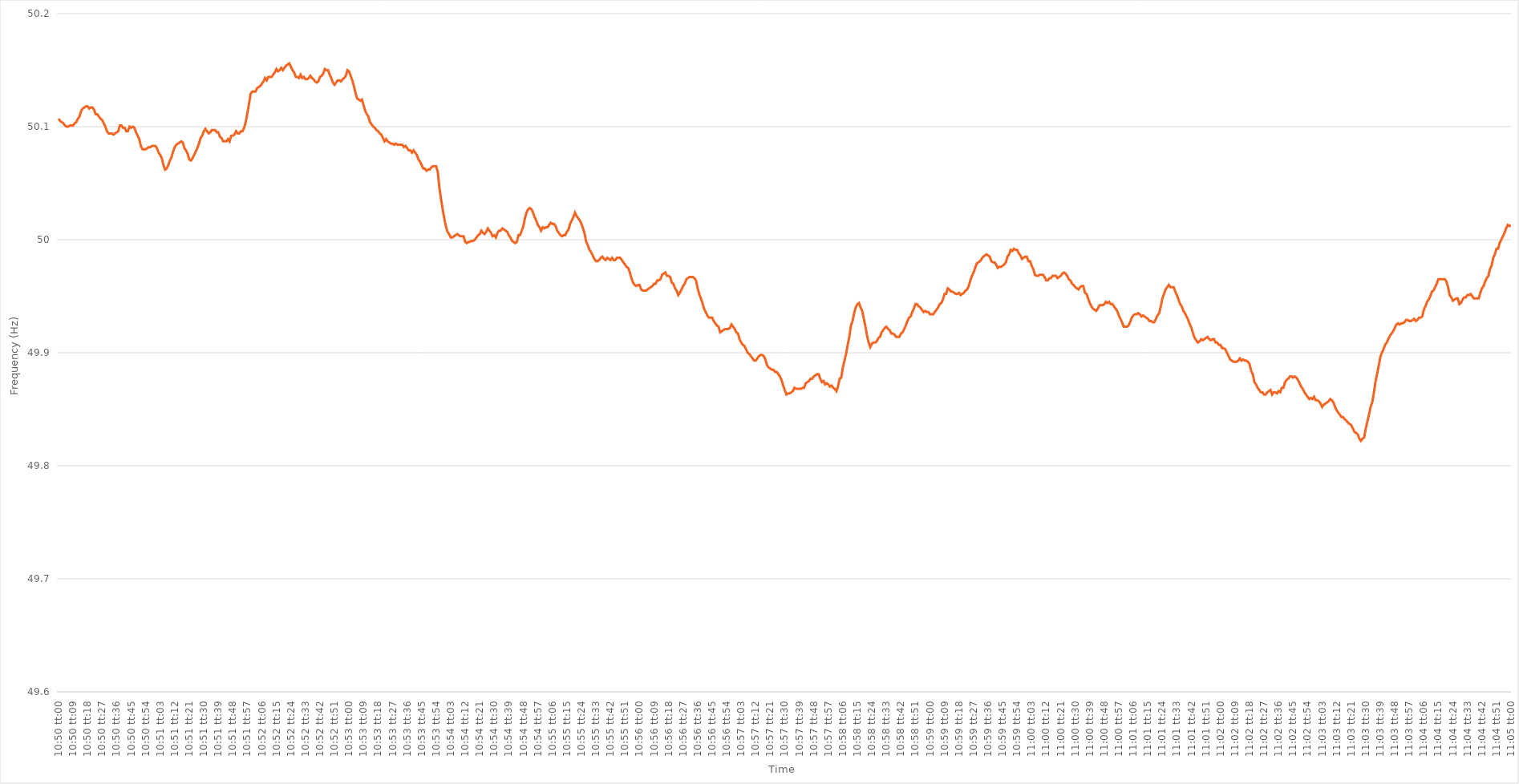
| Category | Series 0 |
|---|---|
| 0.4513888888888889 | 50.107 |
| 0.45140046296296293 | 50.105 |
| 0.4514120370370371 | 50.104 |
| 0.4514236111111111 | 50.103 |
| 0.4514351851851852 | 50.101 |
| 0.45144675925925926 | 50.1 |
| 0.45145833333333335 | 50.1 |
| 0.4514699074074074 | 50.101 |
| 0.45148148148148143 | 50.101 |
| 0.4514930555555556 | 50.101 |
| 0.4515046296296296 | 50.103 |
| 0.4515162037037037 | 50.104 |
| 0.45152777777777775 | 50.107 |
| 0.45153935185185184 | 50.109 |
| 0.4515509259259259 | 50.114 |
| 0.45156250000000003 | 50.116 |
| 0.45157407407407407 | 50.117 |
| 0.45158564814814817 | 50.118 |
| 0.4515972222222222 | 50.118 |
| 0.4516087962962963 | 50.116 |
| 0.45162037037037034 | 50.117 |
| 0.4516319444444445 | 50.117 |
| 0.4516435185185185 | 50.115 |
| 0.4516550925925926 | 50.111 |
| 0.45166666666666666 | 50.111 |
| 0.45167824074074076 | 50.109 |
| 0.4516898148148148 | 50.107 |
| 0.45170138888888894 | 50.106 |
| 0.451712962962963 | 50.103 |
| 0.451724537037037 | 50.1 |
| 0.4517361111111111 | 50.096 |
| 0.45174768518518515 | 50.094 |
| 0.45175925925925925 | 50.094 |
| 0.4517708333333333 | 50.094 |
| 0.45178240740740744 | 50.093 |
| 0.4517939814814815 | 50.094 |
| 0.45180555555555557 | 50.095 |
| 0.4518171296296296 | 50.096 |
| 0.4518287037037037 | 50.101 |
| 0.45184027777777774 | 50.101 |
| 0.4518518518518519 | 50.099 |
| 0.45186342592592593 | 50.099 |
| 0.451875 | 50.096 |
| 0.45188657407407407 | 50.096 |
| 0.45189814814814816 | 50.1 |
| 0.4519097222222222 | 50.099 |
| 0.45192129629629635 | 50.1 |
| 0.4519328703703704 | 50.099 |
| 0.4519444444444444 | 50.095 |
| 0.4519560185185185 | 50.092 |
| 0.45196759259259256 | 50.089 |
| 0.45197916666666665 | 50.083 |
| 0.4519907407407407 | 50.08 |
| 0.45200231481481484 | 50.08 |
| 0.4520138888888889 | 50.08 |
| 0.452025462962963 | 50.081 |
| 0.452037037037037 | 50.082 |
| 0.4520486111111111 | 50.082 |
| 0.45206018518518515 | 50.083 |
| 0.4520717592592593 | 50.083 |
| 0.45208333333333334 | 50.083 |
| 0.45209490740740743 | 50.081 |
| 0.45210648148148147 | 50.077 |
| 0.45211805555555556 | 50.075 |
| 0.4521296296296296 | 50.072 |
| 0.45214120370370375 | 50.066 |
| 0.4521527777777778 | 50.062 |
| 0.4521643518518519 | 50.063 |
| 0.4521759259259259 | 50.066 |
| 0.45218749999999996 | 50.07 |
| 0.45219907407407406 | 50.073 |
| 0.4522106481481481 | 50.078 |
| 0.45222222222222225 | 50.082 |
| 0.4522337962962963 | 50.084 |
| 0.4522453703703704 | 50.085 |
| 0.4522569444444444 | 50.086 |
| 0.4522685185185185 | 50.087 |
| 0.45228009259259255 | 50.086 |
| 0.4522916666666667 | 50.081 |
| 0.45230324074074074 | 50.079 |
| 0.45231481481481484 | 50.076 |
| 0.4523263888888889 | 50.071 |
| 0.45233796296296297 | 50.07 |
| 0.452349537037037 | 50.072 |
| 0.45236111111111116 | 50.075 |
| 0.4523726851851852 | 50.078 |
| 0.4523842592592593 | 50.081 |
| 0.45239583333333333 | 50.085 |
| 0.4524074074074074 | 50.09 |
| 0.45241898148148146 | 50.092 |
| 0.4524305555555555 | 50.096 |
| 0.45244212962962965 | 50.098 |
| 0.4524537037037037 | 50.096 |
| 0.4524652777777778 | 50.094 |
| 0.4524768518518518 | 50.095 |
| 0.4524884259259259 | 50.097 |
| 0.45249999999999996 | 50.097 |
| 0.4525115740740741 | 50.097 |
| 0.45252314814814815 | 50.095 |
| 0.45253472222222224 | 50.095 |
| 0.4525462962962963 | 50.091 |
| 0.4525578703703704 | 50.09 |
| 0.4525694444444444 | 50.087 |
| 0.45258101851851856 | 50.087 |
| 0.4525925925925926 | 50.087 |
| 0.4526041666666667 | 50.089 |
| 0.45261574074074074 | 50.087 |
| 0.45262731481481483 | 50.092 |
| 0.45263888888888887 | 50.092 |
| 0.452650462962963 | 50.093 |
| 0.45266203703703706 | 50.096 |
| 0.4526736111111111 | 50.094 |
| 0.4526851851851852 | 50.094 |
| 0.45269675925925923 | 50.096 |
| 0.4527083333333333 | 50.096 |
| 0.45271990740740736 | 50.099 |
| 0.4527314814814815 | 50.104 |
| 0.45274305555555555 | 50.112 |
| 0.45275462962962965 | 50.12 |
| 0.4527662037037037 | 50.129 |
| 0.4527777777777778 | 50.131 |
| 0.4527893518518518 | 50.131 |
| 0.45280092592592597 | 50.131 |
| 0.4528125 | 50.134 |
| 0.4528240740740741 | 50.135 |
| 0.45283564814814814 | 50.136 |
| 0.45284722222222223 | 50.138 |
| 0.4528587962962963 | 50.14 |
| 0.4528703703703704 | 50.143 |
| 0.45288194444444446 | 50.141 |
| 0.4528935185185185 | 50.144 |
| 0.4529050925925926 | 50.144 |
| 0.45291666666666663 | 50.144 |
| 0.45292824074074073 | 50.146 |
| 0.45293981481481477 | 50.148 |
| 0.4529513888888889 | 50.151 |
| 0.45296296296296296 | 50.149 |
| 0.45297453703703705 | 50.15 |
| 0.4529861111111111 | 50.152 |
| 0.4529976851851852 | 50.15 |
| 0.4530092592592592 | 50.152 |
| 0.4530208333333334 | 50.154 |
| 0.4530324074074074 | 50.155 |
| 0.4530439814814815 | 50.156 |
| 0.45305555555555554 | 50.153 |
| 0.45306712962962964 | 50.15 |
| 0.4530787037037037 | 50.148 |
| 0.45309027777777783 | 50.144 |
| 0.45310185185185187 | 50.144 |
| 0.45311342592592596 | 50.143 |
| 0.453125 | 50.146 |
| 0.45313657407407404 | 50.143 |
| 0.45314814814814813 | 50.144 |
| 0.45315972222222217 | 50.142 |
| 0.4531712962962963 | 50.142 |
| 0.45318287037037036 | 50.143 |
| 0.45319444444444446 | 50.145 |
| 0.4532060185185185 | 50.143 |
| 0.4532175925925926 | 50.142 |
| 0.4532291666666666 | 50.14 |
| 0.4532407407407408 | 50.139 |
| 0.4532523148148148 | 50.14 |
| 0.4532638888888889 | 50.144 |
| 0.45327546296296295 | 50.145 |
| 0.45328703703703704 | 50.147 |
| 0.4532986111111111 | 50.151 |
| 0.45331018518518523 | 50.15 |
| 0.45332175925925927 | 50.15 |
| 0.45333333333333337 | 50.146 |
| 0.4533449074074074 | 50.143 |
| 0.4533564814814815 | 50.139 |
| 0.45336805555555554 | 50.137 |
| 0.4533796296296296 | 50.139 |
| 0.4533912037037037 | 50.141 |
| 0.45340277777777777 | 50.141 |
| 0.45341435185185186 | 50.14 |
| 0.4534259259259259 | 50.142 |
| 0.4534375 | 50.143 |
| 0.45344907407407403 | 50.145 |
| 0.4534606481481482 | 50.15 |
| 0.4534722222222222 | 50.149 |
| 0.4534837962962963 | 50.145 |
| 0.45349537037037035 | 50.141 |
| 0.45350694444444445 | 50.136 |
| 0.4535185185185185 | 50.13 |
| 0.45353009259259264 | 50.125 |
| 0.4535416666666667 | 50.124 |
| 0.45355324074074077 | 50.123 |
| 0.4535648148148148 | 50.124 |
| 0.4535763888888889 | 50.119 |
| 0.45358796296296294 | 50.114 |
| 0.453599537037037 | 50.111 |
| 0.45361111111111113 | 50.109 |
| 0.45362268518518517 | 50.104 |
| 0.45363425925925926 | 50.102 |
| 0.4536458333333333 | 50.1 |
| 0.4536574074074074 | 50.099 |
| 0.45366898148148144 | 50.097 |
| 0.4536805555555556 | 50.096 |
| 0.4536921296296296 | 50.094 |
| 0.4537037037037037 | 50.093 |
| 0.45371527777777776 | 50.09 |
| 0.45372685185185185 | 50.087 |
| 0.4537384259259259 | 50.089 |
| 0.45375000000000004 | 50.087 |
| 0.4537615740740741 | 50.086 |
| 0.4537731481481482 | 50.085 |
| 0.4537847222222222 | 50.085 |
| 0.4537962962962963 | 50.084 |
| 0.45380787037037035 | 50.085 |
| 0.4538194444444445 | 50.084 |
| 0.45383101851851854 | 50.084 |
| 0.4538425925925926 | 50.084 |
| 0.45385416666666667 | 50.084 |
| 0.4538657407407407 | 50.082 |
| 0.4538773148148148 | 50.083 |
| 0.45388888888888884 | 50.081 |
| 0.453900462962963 | 50.079 |
| 0.45391203703703703 | 50.079 |
| 0.4539236111111111 | 50.077 |
| 0.45393518518518516 | 50.079 |
| 0.45394675925925926 | 50.077 |
| 0.4539583333333333 | 50.075 |
| 0.45396990740740745 | 50.071 |
| 0.4539814814814815 | 50.069 |
| 0.4539930555555556 | 50.066 |
| 0.4540046296296296 | 50.063 |
| 0.4540162037037037 | 50.063 |
| 0.45402777777777775 | 50.061 |
| 0.4540393518518519 | 50.062 |
| 0.45405092592592594 | 50.062 |
| 0.45406250000000004 | 50.064 |
| 0.4540740740740741 | 50.065 |
| 0.4540856481481481 | 50.065 |
| 0.4540972222222222 | 50.065 |
| 0.45410879629629625 | 50.06 |
| 0.4541203703703704 | 50.046 |
| 0.45413194444444444 | 50.036 |
| 0.45414351851851853 | 50.027 |
| 0.45415509259259257 | 50.019 |
| 0.45416666666666666 | 50.012 |
| 0.4541782407407407 | 50.007 |
| 0.45418981481481485 | 50.005 |
| 0.4542013888888889 | 50.002 |
| 0.454212962962963 | 50.002 |
| 0.454224537037037 | 50.003 |
| 0.4542361111111111 | 50.004 |
| 0.45424768518518516 | 50.005 |
| 0.4542592592592593 | 50.004 |
| 0.45427083333333335 | 50.003 |
| 0.45428240740740744 | 50.003 |
| 0.4542939814814815 | 50.003 |
| 0.4543055555555556 | 49.998 |
| 0.4543171296296296 | 49.997 |
| 0.45432870370370365 | 49.998 |
| 0.4543402777777778 | 49.998 |
| 0.45435185185185184 | 49.999 |
| 0.45436342592592593 | 49.999 |
| 0.454375 | 50 |
| 0.45438657407407407 | 50.002 |
| 0.4543981481481481 | 50.004 |
| 0.45440972222222226 | 50.005 |
| 0.4544212962962963 | 50.008 |
| 0.4544328703703704 | 50.006 |
| 0.45444444444444443 | 50.005 |
| 0.4544560185185185 | 50.007 |
| 0.45446759259259256 | 50.01 |
| 0.4544791666666667 | 50.008 |
| 0.45449074074074075 | 50.006 |
| 0.45450231481481485 | 50.003 |
| 0.4545138888888889 | 50.004 |
| 0.454525462962963 | 50.002 |
| 0.454537037037037 | 50.006 |
| 0.45454861111111106 | 50.008 |
| 0.4545601851851852 | 50.008 |
| 0.45457175925925924 | 50.01 |
| 0.45458333333333334 | 50.009 |
| 0.4545949074074074 | 50.008 |
| 0.4546064814814815 | 50.007 |
| 0.4546180555555555 | 50.004 |
| 0.45462962962962966 | 50.002 |
| 0.4546412037037037 | 49.999 |
| 0.4546527777777778 | 49.998 |
| 0.45466435185185183 | 49.997 |
| 0.45467592592592593 | 49.998 |
| 0.45468749999999997 | 50.004 |
| 0.4546990740740741 | 50.004 |
| 0.45471064814814816 | 50.008 |
| 0.45472222222222225 | 50.012 |
| 0.4547337962962963 | 50.019 |
| 0.4547453703703704 | 50.024 |
| 0.4547569444444444 | 50.027 |
| 0.45476851851851857 | 50.028 |
| 0.4547800925925926 | 50.027 |
| 0.45479166666666665 | 50.024 |
| 0.45480324074074074 | 50.02 |
| 0.4548148148148148 | 50.017 |
| 0.4548263888888889 | 50.013 |
| 0.4548379629629629 | 50.011 |
| 0.45484953703703707 | 50.008 |
| 0.4548611111111111 | 50.011 |
| 0.4548726851851852 | 50.01 |
| 0.45488425925925924 | 50.011 |
| 0.45489583333333333 | 50.011 |
| 0.45490740740740737 | 50.013 |
| 0.4549189814814815 | 50.015 |
| 0.45493055555555556 | 50.014 |
| 0.45494212962962965 | 50.014 |
| 0.4549537037037037 | 50.012 |
| 0.4549652777777778 | 50.008 |
| 0.4549768518518518 | 50.006 |
| 0.454988425925926 | 50.004 |
| 0.455 | 50.003 |
| 0.4550115740740741 | 50.004 |
| 0.45502314814814815 | 50.004 |
| 0.4550347222222222 | 50.007 |
| 0.4550462962962963 | 50.009 |
| 0.4550578703703703 | 50.014 |
| 0.45506944444444447 | 50.017 |
| 0.4550810185185185 | 50.02 |
| 0.4550925925925926 | 50.024 |
| 0.45510416666666664 | 50.021 |
| 0.45511574074074074 | 50.019 |
| 0.4551273148148148 | 50.017 |
| 0.4551388888888889 | 50.014 |
| 0.45515046296296297 | 50.01 |
| 0.45516203703703706 | 50.005 |
| 0.4551736111111111 | 49.998 |
| 0.4551851851851852 | 49.995 |
| 0.45519675925925923 | 49.991 |
| 0.4552083333333334 | 49.989 |
| 0.4552199074074074 | 49.986 |
| 0.4552314814814815 | 49.983 |
| 0.45524305555555555 | 49.981 |
| 0.45525462962962965 | 49.981 |
| 0.4552662037037037 | 49.982 |
| 0.4552777777777777 | 49.984 |
| 0.4552893518518519 | 49.985 |
| 0.4553009259259259 | 49.983 |
| 0.4553125 | 49.982 |
| 0.45532407407407405 | 49.984 |
| 0.45533564814814814 | 49.983 |
| 0.4553472222222222 | 49.982 |
| 0.45535879629629633 | 49.984 |
| 0.45537037037037037 | 49.982 |
| 0.45538194444444446 | 49.982 |
| 0.4553935185185185 | 49.984 |
| 0.4554050925925926 | 49.984 |
| 0.45541666666666664 | 49.984 |
| 0.4554282407407408 | 49.982 |
| 0.4554398148148148 | 49.98 |
| 0.4554513888888889 | 49.978 |
| 0.45546296296296296 | 49.976 |
| 0.45547453703703705 | 49.975 |
| 0.4554861111111111 | 49.971 |
| 0.45549768518518513 | 49.966 |
| 0.4555092592592593 | 49.962 |
| 0.4555208333333333 | 49.96 |
| 0.4555324074074074 | 49.959 |
| 0.45554398148148145 | 49.96 |
| 0.45555555555555555 | 49.96 |
| 0.4555671296296296 | 49.956 |
| 0.45557870370370374 | 49.955 |
| 0.4555902777777778 | 49.955 |
| 0.45560185185185187 | 49.955 |
| 0.4556134259259259 | 49.956 |
| 0.455625 | 49.957 |
| 0.45563657407407404 | 49.958 |
| 0.4556481481481482 | 49.959 |
| 0.45565972222222223 | 49.961 |
| 0.4556712962962963 | 49.961 |
| 0.45568287037037036 | 49.964 |
| 0.45569444444444446 | 49.964 |
| 0.4557060185185185 | 49.965 |
| 0.45571759259259265 | 49.969 |
| 0.4557291666666667 | 49.97 |
| 0.4557407407407407 | 49.971 |
| 0.4557523148148148 | 49.968 |
| 0.45576388888888886 | 49.968 |
| 0.45577546296296295 | 49.967 |
| 0.455787037037037 | 49.962 |
| 0.45579861111111114 | 49.961 |
| 0.4558101851851852 | 49.957 |
| 0.4558217592592593 | 49.955 |
| 0.4558333333333333 | 49.951 |
| 0.4558449074074074 | 49.953 |
| 0.45585648148148145 | 49.956 |
| 0.4558680555555556 | 49.959 |
| 0.45587962962962963 | 49.961 |
| 0.45589120370370373 | 49.965 |
| 0.45590277777777777 | 49.966 |
| 0.45591435185185186 | 49.967 |
| 0.4559259259259259 | 49.967 |
| 0.45593750000000005 | 49.967 |
| 0.4559490740740741 | 49.966 |
| 0.4559606481481482 | 49.964 |
| 0.4559722222222222 | 49.957 |
| 0.45598379629629626 | 49.952 |
| 0.45599537037037036 | 49.948 |
| 0.4560069444444444 | 49.944 |
| 0.45601851851851855 | 49.939 |
| 0.4560300925925926 | 49.936 |
| 0.4560416666666667 | 49.933 |
| 0.4560532407407407 | 49.931 |
| 0.4560648148148148 | 49.931 |
| 0.45607638888888885 | 49.931 |
| 0.456087962962963 | 49.928 |
| 0.45609953703703704 | 49.926 |
| 0.45611111111111113 | 49.924 |
| 0.4561226851851852 | 49.923 |
| 0.45613425925925927 | 49.918 |
| 0.4561458333333333 | 49.919 |
| 0.45615740740740746 | 49.92 |
| 0.4561689814814815 | 49.921 |
| 0.4561805555555556 | 49.921 |
| 0.45619212962962963 | 49.921 |
| 0.45620370370370367 | 49.922 |
| 0.45621527777777776 | 49.925 |
| 0.4562268518518518 | 49.923 |
| 0.45623842592592595 | 49.921 |
| 0.45625 | 49.918 |
| 0.4562615740740741 | 49.917 |
| 0.4562731481481481 | 49.912 |
| 0.4562847222222222 | 49.909 |
| 0.45629629629629626 | 49.907 |
| 0.4563078703703704 | 49.906 |
| 0.45631944444444444 | 49.903 |
| 0.45633101851851854 | 49.9 |
| 0.4563425925925926 | 49.899 |
| 0.45635416666666667 | 49.897 |
| 0.4563657407407407 | 49.895 |
| 0.45637731481481486 | 49.893 |
| 0.4563888888888889 | 49.893 |
| 0.456400462962963 | 49.895 |
| 0.45641203703703703 | 49.897 |
| 0.4564236111111111 | 49.898 |
| 0.45643518518518517 | 49.898 |
| 0.4564467592592592 | 49.897 |
| 0.45645833333333335 | 49.894 |
| 0.4564699074074074 | 49.889 |
| 0.4564814814814815 | 49.887 |
| 0.4564930555555555 | 49.886 |
| 0.4565046296296296 | 49.885 |
| 0.45651620370370366 | 49.885 |
| 0.4565277777777778 | 49.883 |
| 0.45653935185185185 | 49.883 |
| 0.45655092592592594 | 49.881 |
| 0.4565625 | 49.879 |
| 0.4565740740740741 | 49.876 |
| 0.4565856481481481 | 49.871 |
| 0.45659722222222227 | 49.867 |
| 0.4566087962962963 | 49.863 |
| 0.4566203703703704 | 49.864 |
| 0.45663194444444444 | 49.864 |
| 0.45664351851851853 | 49.865 |
| 0.45665509259259257 | 49.866 |
| 0.4566666666666667 | 49.869 |
| 0.45667824074074076 | 49.868 |
| 0.4566898148148148 | 49.868 |
| 0.4567013888888889 | 49.868 |
| 0.45671296296296293 | 49.868 |
| 0.456724537037037 | 49.869 |
| 0.45673611111111106 | 49.869 |
| 0.4567476851851852 | 49.873 |
| 0.45675925925925925 | 49.874 |
| 0.45677083333333335 | 49.875 |
| 0.4567824074074074 | 49.877 |
| 0.4567939814814815 | 49.877 |
| 0.4568055555555555 | 49.879 |
| 0.45681712962962967 | 49.88 |
| 0.4568287037037037 | 49.881 |
| 0.4568402777777778 | 49.881 |
| 0.45685185185185184 | 49.877 |
| 0.45686342592592594 | 49.874 |
| 0.456875 | 49.875 |
| 0.4568865740740741 | 49.872 |
| 0.45689814814814816 | 49.873 |
| 0.45690972222222226 | 49.872 |
| 0.4569212962962963 | 49.87 |
| 0.45693287037037034 | 49.871 |
| 0.45694444444444443 | 49.869 |
| 0.45695601851851847 | 49.868 |
| 0.4569675925925926 | 49.866 |
| 0.45697916666666666 | 49.87 |
| 0.45699074074074075 | 49.877 |
| 0.4570023148148148 | 49.878 |
| 0.4570138888888889 | 49.887 |
| 0.4570254629629629 | 49.893 |
| 0.4570370370370371 | 49.899 |
| 0.4570486111111111 | 49.907 |
| 0.4570601851851852 | 49.914 |
| 0.45707175925925925 | 49.924 |
| 0.45708333333333334 | 49.928 |
| 0.4570949074074074 | 49.935 |
| 0.45710648148148153 | 49.94 |
| 0.45711805555555557 | 49.943 |
| 0.45712962962962966 | 49.944 |
| 0.4571412037037037 | 49.94 |
| 0.45715277777777774 | 49.937 |
| 0.45716435185185184 | 49.93 |
| 0.4571759259259259 | 49.923 |
| 0.4571875 | 49.915 |
| 0.45719907407407406 | 49.909 |
| 0.45721064814814816 | 49.905 |
| 0.4572222222222222 | 49.908 |
| 0.4572337962962963 | 49.909 |
| 0.45724537037037033 | 49.909 |
| 0.4572569444444445 | 49.91 |
| 0.4572685185185185 | 49.913 |
| 0.4572800925925926 | 49.914 |
| 0.45729166666666665 | 49.918 |
| 0.45730324074074075 | 49.92 |
| 0.4573148148148148 | 49.922 |
| 0.45732638888888894 | 49.923 |
| 0.457337962962963 | 49.921 |
| 0.45734953703703707 | 49.92 |
| 0.4573611111111111 | 49.917 |
| 0.4573726851851852 | 49.917 |
| 0.45738425925925924 | 49.916 |
| 0.4573958333333333 | 49.914 |
| 0.45740740740740743 | 49.914 |
| 0.45741898148148147 | 49.914 |
| 0.45743055555555556 | 49.917 |
| 0.4574421296296296 | 49.918 |
| 0.4574537037037037 | 49.921 |
| 0.45746527777777773 | 49.924 |
| 0.4574768518518519 | 49.928 |
| 0.4574884259259259 | 49.931 |
| 0.4575 | 49.932 |
| 0.45751157407407406 | 49.936 |
| 0.45752314814814815 | 49.939 |
| 0.4575347222222222 | 49.943 |
| 0.45754629629629634 | 49.943 |
| 0.4575578703703704 | 49.941 |
| 0.4575694444444445 | 49.94 |
| 0.4575810185185185 | 49.938 |
| 0.4575925925925926 | 49.936 |
| 0.45760416666666665 | 49.937 |
| 0.4576157407407408 | 49.936 |
| 0.45762731481481483 | 49.936 |
| 0.4576388888888889 | 49.934 |
| 0.45765046296296297 | 49.934 |
| 0.457662037037037 | 49.934 |
| 0.4576736111111111 | 49.936 |
| 0.45768518518518514 | 49.938 |
| 0.4576967592592593 | 49.94 |
| 0.45770833333333333 | 49.943 |
| 0.4577199074074074 | 49.944 |
| 0.45773148148148146 | 49.947 |
| 0.45774305555555556 | 49.952 |
| 0.4577546296296296 | 49.952 |
| 0.45776620370370374 | 49.957 |
| 0.4577777777777778 | 49.956 |
| 0.4577893518518519 | 49.954 |
| 0.4578009259259259 | 49.954 |
| 0.4578125 | 49.953 |
| 0.45782407407407405 | 49.952 |
| 0.4578356481481482 | 49.952 |
| 0.45784722222222224 | 49.953 |
| 0.45785879629629633 | 49.951 |
| 0.45787037037037037 | 49.952 |
| 0.4578819444444444 | 49.953 |
| 0.4578935185185185 | 49.955 |
| 0.45790509259259254 | 49.956 |
| 0.4579166666666667 | 49.959 |
| 0.45792824074074073 | 49.964 |
| 0.4579398148148148 | 49.968 |
| 0.45795138888888887 | 49.971 |
| 0.45796296296296296 | 49.975 |
| 0.457974537037037 | 49.979 |
| 0.45798611111111115 | 49.98 |
| 0.4579976851851852 | 49.981 |
| 0.4580092592592593 | 49.983 |
| 0.4580208333333333 | 49.985 |
| 0.4580324074074074 | 49.986 |
| 0.45804398148148145 | 49.987 |
| 0.4580555555555556 | 49.986 |
| 0.45806712962962964 | 49.985 |
| 0.45807870370370374 | 49.981 |
| 0.4580902777777778 | 49.98 |
| 0.4581018518518518 | 49.98 |
| 0.4581134259259259 | 49.978 |
| 0.45812499999999995 | 49.975 |
| 0.4581365740740741 | 49.976 |
| 0.45814814814814814 | 49.976 |
| 0.45815972222222223 | 49.977 |
| 0.45817129629629627 | 49.978 |
| 0.45818287037037037 | 49.98 |
| 0.4581944444444444 | 49.985 |
| 0.45820601851851855 | 49.987 |
| 0.4582175925925926 | 49.991 |
| 0.4582291666666667 | 49.99 |
| 0.4582407407407407 | 49.992 |
| 0.4582523148148148 | 49.991 |
| 0.45826388888888886 | 49.991 |
| 0.458275462962963 | 49.988 |
| 0.45828703703703705 | 49.986 |
| 0.45829861111111114 | 49.983 |
| 0.4583101851851852 | 49.984 |
| 0.4583217592592593 | 49.985 |
| 0.4583333333333333 | 49.985 |
| 0.45834490740740735 | 49.981 |
| 0.4583564814814815 | 49.981 |
| 0.45836805555555554 | 49.977 |
| 0.45837962962962964 | 49.974 |
| 0.4583912037037037 | 49.969 |
| 0.45840277777777777 | 49.968 |
| 0.4584143518518518 | 49.968 |
| 0.45842592592592596 | 49.969 |
| 0.4584375 | 49.969 |
| 0.4584490740740741 | 49.969 |
| 0.45846064814814813 | 49.967 |
| 0.4584722222222222 | 49.964 |
| 0.45848379629629626 | 49.964 |
| 0.4584953703703704 | 49.966 |
| 0.45850694444444445 | 49.966 |
| 0.45851851851851855 | 49.968 |
| 0.4585300925925926 | 49.968 |
| 0.4585416666666667 | 49.968 |
| 0.4585532407407407 | 49.966 |
| 0.45856481481481487 | 49.967 |
| 0.4585763888888889 | 49.968 |
| 0.45858796296296295 | 49.97 |
| 0.45859953703703704 | 49.971 |
| 0.4586111111111111 | 49.97 |
| 0.4586226851851852 | 49.968 |
| 0.4586342592592592 | 49.965 |
| 0.45864583333333336 | 49.964 |
| 0.4586574074074074 | 49.961 |
| 0.4586689814814815 | 49.96 |
| 0.45868055555555554 | 49.958 |
| 0.45869212962962963 | 49.957 |
| 0.45870370370370367 | 49.956 |
| 0.4587152777777778 | 49.958 |
| 0.45872685185185186 | 49.959 |
| 0.45873842592592595 | 49.959 |
| 0.45875 | 49.953 |
| 0.4587615740740741 | 49.952 |
| 0.4587731481481481 | 49.948 |
| 0.4587847222222223 | 49.944 |
| 0.4587962962962963 | 49.941 |
| 0.45880787037037035 | 49.939 |
| 0.45881944444444445 | 49.938 |
| 0.4588310185185185 | 49.937 |
| 0.4588425925925926 | 49.939 |
| 0.4588541666666666 | 49.942 |
| 0.45886574074074077 | 49.942 |
| 0.4588773148148148 | 49.942 |
| 0.4588888888888889 | 49.943 |
| 0.45890046296296294 | 49.945 |
| 0.45891203703703703 | 49.944 |
| 0.4589236111111111 | 49.945 |
| 0.4589351851851852 | 49.943 |
| 0.45894675925925926 | 49.943 |
| 0.45895833333333336 | 49.941 |
| 0.4589699074074074 | 49.939 |
| 0.4589814814814815 | 49.937 |
| 0.45899305555555553 | 49.933 |
| 0.4590046296296297 | 49.93 |
| 0.4590162037037037 | 49.927 |
| 0.4590277777777778 | 49.923 |
| 0.45903935185185185 | 49.923 |
| 0.4590509259259259 | 49.923 |
| 0.4590625 | 49.924 |
| 0.459074074074074 | 49.927 |
| 0.4590856481481482 | 49.931 |
| 0.4590972222222222 | 49.933 |
| 0.4591087962962963 | 49.934 |
| 0.45912037037037035 | 49.934 |
| 0.45913194444444444 | 49.935 |
| 0.4591435185185185 | 49.934 |
| 0.45915509259259263 | 49.932 |
| 0.45916666666666667 | 49.933 |
| 0.45917824074074076 | 49.932 |
| 0.4591898148148148 | 49.931 |
| 0.4592013888888889 | 49.93 |
| 0.45921296296296293 | 49.928 |
| 0.4592245370370371 | 49.928 |
| 0.4592361111111111 | 49.927 |
| 0.4592476851851852 | 49.927 |
| 0.45925925925925926 | 49.93 |
| 0.45927083333333335 | 49.933 |
| 0.4592824074074074 | 49.935 |
| 0.45929398148148143 | 49.941 |
| 0.4593055555555556 | 49.948 |
| 0.4593171296296296 | 49.952 |
| 0.4593287037037037 | 49.956 |
| 0.45934027777777775 | 49.958 |
| 0.45935185185185184 | 49.96 |
| 0.4593634259259259 | 49.958 |
| 0.45937500000000003 | 49.958 |
| 0.45938657407407407 | 49.958 |
| 0.45939814814814817 | 49.954 |
| 0.4594097222222222 | 49.951 |
| 0.4594212962962963 | 49.947 |
| 0.45943287037037034 | 49.943 |
| 0.4594444444444445 | 49.941 |
| 0.4594560185185185 | 49.937 |
| 0.4594675925925926 | 49.935 |
| 0.45947916666666666 | 49.932 |
| 0.45949074074074076 | 49.929 |
| 0.4595023148148148 | 49.925 |
| 0.45951388888888894 | 49.922 |
| 0.459525462962963 | 49.917 |
| 0.459537037037037 | 49.913 |
| 0.4595486111111111 | 49.911 |
| 0.45956018518518515 | 49.909 |
| 0.45957175925925925 | 49.91 |
| 0.4595833333333333 | 49.912 |
| 0.45959490740740744 | 49.911 |
| 0.4596064814814815 | 49.912 |
| 0.45961805555555557 | 49.913 |
| 0.4596296296296296 | 49.914 |
| 0.4596412037037037 | 49.912 |
| 0.45965277777777774 | 49.911 |
| 0.4596643518518519 | 49.912 |
| 0.45967592592592593 | 49.912 |
| 0.4596875 | 49.909 |
| 0.45969907407407407 | 49.909 |
| 0.45971064814814816 | 49.907 |
| 0.4597222222222222 | 49.907 |
| 0.45973379629629635 | 49.904 |
| 0.4597453703703704 | 49.904 |
| 0.4597569444444444 | 49.903 |
| 0.4597685185185185 | 49.9 |
| 0.45978009259259256 | 49.897 |
| 0.45979166666666665 | 49.894 |
| 0.4598032407407407 | 49.893 |
| 0.45981481481481484 | 49.892 |
| 0.4598263888888889 | 49.892 |
| 0.459837962962963 | 49.892 |
| 0.459849537037037 | 49.893 |
| 0.4598611111111111 | 49.895 |
| 0.45987268518518515 | 49.893 |
| 0.4598842592592593 | 49.894 |
| 0.45989583333333334 | 49.893 |
| 0.45990740740740743 | 49.893 |
| 0.45991898148148147 | 49.892 |
| 0.45993055555555556 | 49.89 |
| 0.4599421296296296 | 49.884 |
| 0.45995370370370375 | 49.881 |
| 0.4599652777777778 | 49.874 |
| 0.4599768518518519 | 49.872 |
| 0.4599884259259259 | 49.869 |
| 0.45999999999999996 | 49.867 |
| 0.46001157407407406 | 49.865 |
| 0.4600231481481481 | 49.865 |
| 0.46003472222222225 | 49.863 |
| 0.4600462962962963 | 49.863 |
| 0.4600578703703704 | 49.865 |
| 0.4600694444444444 | 49.866 |
| 0.4600810185185185 | 49.867 |
| 0.46009259259259255 | 49.863 |
| 0.4601041666666667 | 49.865 |
| 0.46011574074074074 | 49.865 |
| 0.46012731481481484 | 49.864 |
| 0.4601388888888889 | 49.866 |
| 0.46015046296296297 | 49.865 |
| 0.460162037037037 | 49.869 |
| 0.46017361111111116 | 49.869 |
| 0.4601851851851852 | 49.874 |
| 0.4601967592592593 | 49.876 |
| 0.46020833333333333 | 49.877 |
| 0.4602199074074074 | 49.879 |
| 0.46023148148148146 | 49.879 |
| 0.4602430555555555 | 49.878 |
| 0.46025462962962965 | 49.879 |
| 0.4602662037037037 | 49.878 |
| 0.4602777777777778 | 49.876 |
| 0.4602893518518518 | 49.873 |
| 0.4603009259259259 | 49.87 |
| 0.46031249999999996 | 49.868 |
| 0.4603240740740741 | 49.865 |
| 0.46033564814814815 | 49.863 |
| 0.46034722222222224 | 49.861 |
| 0.4603587962962963 | 49.859 |
| 0.4603703703703704 | 49.86 |
| 0.4603819444444444 | 49.859 |
| 0.46039351851851856 | 49.861 |
| 0.4604050925925926 | 49.858 |
| 0.4604166666666667 | 49.858 |
| 0.46042824074074074 | 49.857 |
| 0.46043981481481483 | 49.855 |
| 0.46045138888888887 | 49.852 |
| 0.460462962962963 | 49.854 |
| 0.46047453703703706 | 49.855 |
| 0.4604861111111111 | 49.856 |
| 0.4604976851851852 | 49.857 |
| 0.46050925925925923 | 49.859 |
| 0.4605208333333333 | 49.858 |
| 0.46053240740740736 | 49.856 |
| 0.4605439814814815 | 49.852 |
| 0.46055555555555555 | 49.849 |
| 0.46056712962962965 | 49.847 |
| 0.4605787037037037 | 49.845 |
| 0.4605902777777778 | 49.843 |
| 0.4606018518518518 | 49.843 |
| 0.46061342592592597 | 49.841 |
| 0.460625 | 49.84 |
| 0.4606365740740741 | 49.838 |
| 0.46064814814814814 | 49.837 |
| 0.46065972222222223 | 49.836 |
| 0.4606712962962963 | 49.833 |
| 0.4606828703703704 | 49.83 |
| 0.46069444444444446 | 49.829 |
| 0.4607060185185185 | 49.828 |
| 0.4607175925925926 | 49.824 |
| 0.46072916666666663 | 49.822 |
| 0.46074074074074073 | 49.824 |
| 0.46075231481481477 | 49.825 |
| 0.4607638888888889 | 49.833 |
| 0.46077546296296296 | 49.839 |
| 0.46078703703703705 | 49.845 |
| 0.4607986111111111 | 49.852 |
| 0.4608101851851852 | 49.856 |
| 0.4608217592592592 | 49.864 |
| 0.4608333333333334 | 49.874 |
| 0.4608449074074074 | 49.881 |
| 0.4608564814814815 | 49.888 |
| 0.46086805555555554 | 49.896 |
| 0.46087962962962964 | 49.9 |
| 0.4608912037037037 | 49.903 |
| 0.46090277777777783 | 49.907 |
| 0.46091435185185187 | 49.909 |
| 0.46092592592592596 | 49.912 |
| 0.4609375 | 49.915 |
| 0.46094907407407404 | 49.917 |
| 0.46096064814814813 | 49.919 |
| 0.46097222222222217 | 49.922 |
| 0.4609837962962963 | 49.925 |
| 0.46099537037037036 | 49.926 |
| 0.46100694444444446 | 49.925 |
| 0.4610185185185185 | 49.926 |
| 0.4610300925925926 | 49.926 |
| 0.4610416666666666 | 49.927 |
| 0.4610532407407408 | 49.929 |
| 0.4610648148148148 | 49.929 |
| 0.4610763888888889 | 49.928 |
| 0.46108796296296295 | 49.928 |
| 0.46109953703703704 | 49.929 |
| 0.4611111111111111 | 49.93 |
| 0.46112268518518523 | 49.928 |
| 0.46113425925925927 | 49.929 |
| 0.46114583333333337 | 49.931 |
| 0.4611574074074074 | 49.931 |
| 0.4611689814814815 | 49.932 |
| 0.46118055555555554 | 49.938 |
| 0.4611921296296296 | 49.941 |
| 0.4612037037037037 | 49.945 |
| 0.46121527777777777 | 49.947 |
| 0.46122685185185186 | 49.95 |
| 0.4612384259259259 | 49.954 |
| 0.46125 | 49.955 |
| 0.46126157407407403 | 49.958 |
| 0.4612731481481482 | 49.961 |
| 0.4612847222222222 | 49.965 |
| 0.4612962962962963 | 49.965 |
| 0.46130787037037035 | 49.965 |
| 0.46131944444444445 | 49.965 |
| 0.4613310185185185 | 49.965 |
| 0.46134259259259264 | 49.963 |
| 0.4613541666666667 | 49.958 |
| 0.46136574074074077 | 49.951 |
| 0.4613773148148148 | 49.949 |
| 0.4613888888888889 | 49.946 |
| 0.46140046296296294 | 49.947 |
| 0.461412037037037 | 49.948 |
| 0.46142361111111113 | 49.948 |
| 0.46143518518518517 | 49.943 |
| 0.46144675925925926 | 49.944 |
| 0.4614583333333333 | 49.947 |
| 0.4614699074074074 | 49.949 |
| 0.46148148148148144 | 49.949 |
| 0.4614930555555556 | 49.951 |
| 0.4615046296296296 | 49.951 |
| 0.4615162037037037 | 49.952 |
| 0.46152777777777776 | 49.95 |
| 0.46153935185185185 | 49.948 |
| 0.4615509259259259 | 49.948 |
| 0.46156250000000004 | 49.948 |
| 0.4615740740740741 | 49.948 |
| 0.4615856481481482 | 49.953 |
| 0.4615972222222222 | 49.957 |
| 0.4616087962962963 | 49.959 |
| 0.46162037037037035 | 49.963 |
| 0.4616319444444445 | 49.966 |
| 0.46164351851851854 | 49.968 |
| 0.4616550925925926 | 49.974 |
| 0.46166666666666667 | 49.977 |
| 0.4616782407407407 | 49.984 |
| 0.4616898148148148 | 49.987 |
| 0.46170138888888884 | 49.992 |
| 0.461712962962963 | 49.992 |
| 0.46172453703703703 | 49.997 |
| 0.4617361111111111 | 50 |
| 0.46174768518518516 | 50.003 |
| 0.46175925925925926 | 50.006 |
| 0.4617708333333333 | 50.01 |
| 0.46178240740740745 | 50.013 |
| 0.4617939814814815 | 50.012 |
| 0.4618055555555556 | 50.013 |